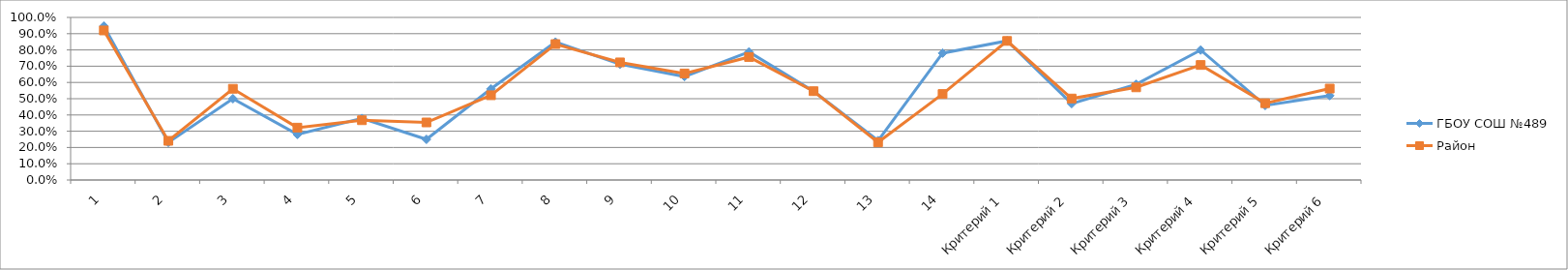
| Category | ГБОУ СОШ №489 | Район |
|---|---|---|
| 1 | 0.947 | 0.92 |
| 2 | 0.231 | 0.241 |
| 3 | 0.5 | 0.561 |
| 4 | 0.28 | 0.322 |
| 5 | 0.379 | 0.368 |
| 6 | 0.25 | 0.354 |
| 7 | 0.561 | 0.521 |
| 8 | 0.848 | 0.836 |
| 9 | 0.712 | 0.723 |
| 10 | 0.636 | 0.655 |
| 11 | 0.788 | 0.756 |
| 12 | 0.545 | 0.546 |
| 13 | 0.242 | 0.232 |
| 14 | 0.78 | 0.529 |
| Критерий 1 | 0.856 | 0.855 |
| Критерий 2 | 0.47 | 0.501 |
| Критерий 3 | 0.588 | 0.57 |
| Критерий 4 | 0.799 | 0.707 |
| Критерий 5 | 0.458 | 0.472 |
| Критерий 6 | 0.519 | 0.562 |